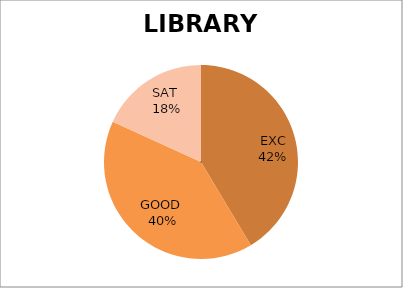
| Category | Series 0 |
|---|---|
| EXC | 41 |
| GOOD  | 40 |
| SAT  | 18 |